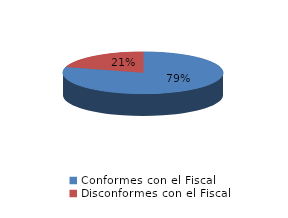
| Category | Series 0 |
|---|---|
| 0 | 1377 |
| 1 | 356 |